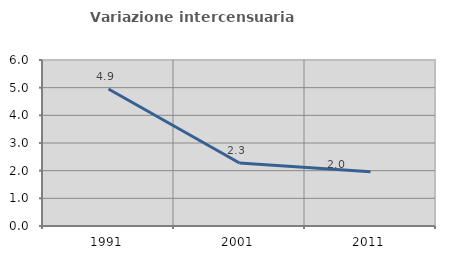
| Category | Variazione intercensuaria annua |
|---|---|
| 1991.0 | 4.95 |
| 2001.0 | 2.278 |
| 2011.0 | 1.964 |